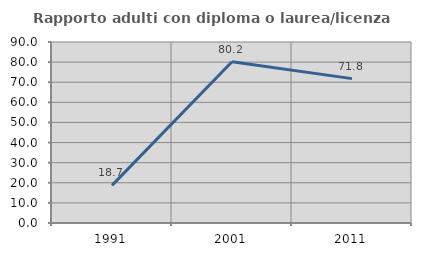
| Category | Rapporto adulti con diploma o laurea/licenza media  |
|---|---|
| 1991.0 | 18.699 |
| 2001.0 | 80.159 |
| 2011.0 | 71.795 |